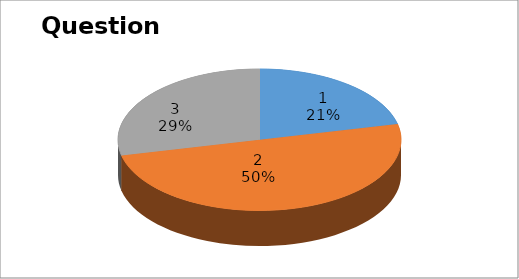
| Category | Series 0 |
|---|---|
| 0 | 3 |
| 1 | 7 |
| 2 | 4 |